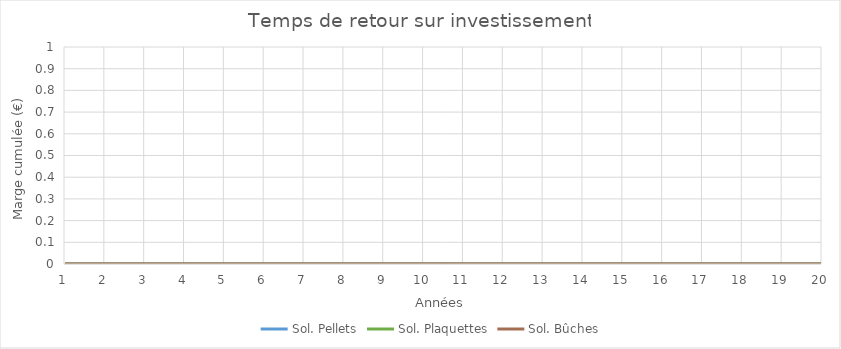
| Category | Sol. Pellets | Sol. Plaquettes | Sol. Bûches |
|---|---|---|---|
| 1.0 | 0 | 0 | 0 |
| 2.0 | 0 | 0 | 0 |
| 3.0 | 0 | 0 | 0 |
| 4.0 | 0 | 0 | 0 |
| 5.0 | 0 | 0 | 0 |
| 6.0 | 0 | 0 | 0 |
| 7.0 | 0 | 0 | 0 |
| 8.0 | 0 | 0 | 0 |
| 9.0 | 0 | 0 | 0 |
| 10.0 | 0 | 0 | 0 |
| 11.0 | 0 | 0 | 0 |
| 12.0 | 0 | 0 | 0 |
| 13.0 | 0 | 0 | 0 |
| 14.0 | 0 | 0 | 0 |
| 15.0 | 0 | 0 | 0 |
| 16.0 | 0 | 0 | 0 |
| 17.0 | 0 | 0 | 0 |
| 18.0 | 0 | 0 | 0 |
| 19.0 | 0 | 0 | 0 |
| 20.0 | 0 | 0 | 0 |